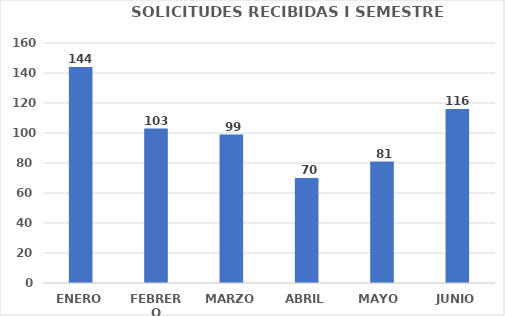
| Category | Series 0 |
|---|---|
| ENERO | 144 |
| FEBRERO | 103 |
| MARZO | 99 |
| ABRIL | 70 |
| MAYO  | 81 |
| JUNIO | 116 |